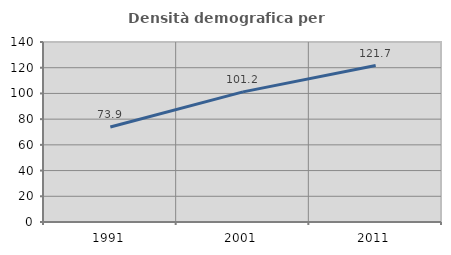
| Category | Densità demografica |
|---|---|
| 1991.0 | 73.904 |
| 2001.0 | 101.213 |
| 2011.0 | 121.656 |